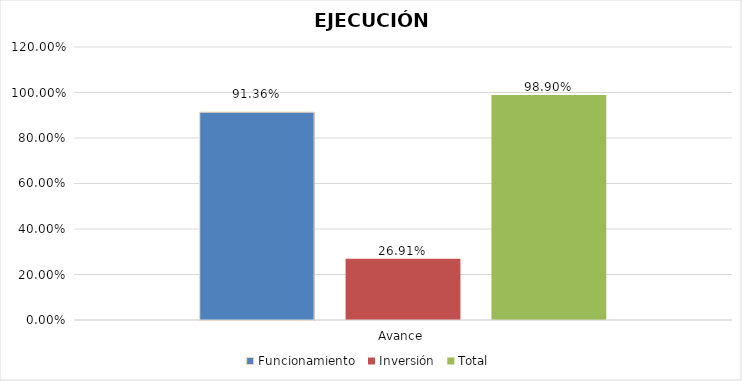
| Category | Funcionamiento  | Inversión  | Total |
|---|---|---|---|
| Avance | 0.914 | 0.269 | 0.989 |